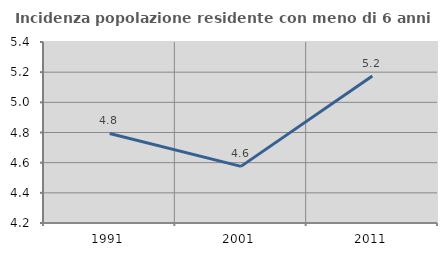
| Category | Incidenza popolazione residente con meno di 6 anni |
|---|---|
| 1991.0 | 4.793 |
| 2001.0 | 4.575 |
| 2011.0 | 5.174 |